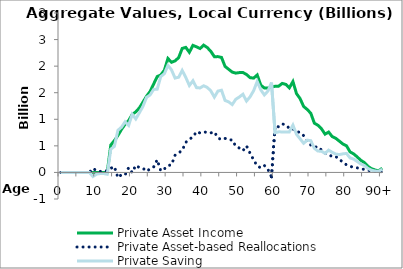
| Category | Private Asset Income | Private Asset-based Reallocations | Private Saving |
|---|---|---|---|
| 0 | 0 | -0.02 | 0.02 |
|  | 0 | 0.034 | -0.034 |
| 2 | 0 | 0 | 0 |
| 3 | 0 | -0.029 | 0.029 |
| 4 | 0 | -0.026 | 0.026 |
| 5 | 0 | -0.035 | 0.035 |
| 6 | 0 | -0.069 | 0.069 |
| 7 | 0 | -0.424 | 0.424 |
| 8 | 0 | -0.85 | 0.85 |
| 9 | 0 | 77.325 | -77.325 |
| 10 | 0 | 33.396 | -33.396 |
| 11 | 0 | 20.393 | -20.393 |
| 12 | 0 | 20.771 | -20.771 |
| 13 | 0 | 34.38 | -34.38 |
| 14 | 515.43 | 77.559 | 437.871 |
| 15 | 599.381 | 109.825 | 489.556 |
| 16 | 695.474 | -97.931 | 793.404 |
| 17 | 809.643 | -41.545 | 851.187 |
| 18 | 906.04 | -46.677 | 952.717 |
| 19 | 975.077 | 90.007 | 885.07 |
| 20 | 1092.235 | -2.998 | 1095.233 |
| 21 | 1139.297 | 132.756 | 1006.541 |
| 22 | 1213.84 | 91.339 | 1122.502 |
| 23 | 1321.48 | 79.38 | 1242.1 |
| 24 | 1432.878 | 21.249 | 1411.629 |
| 25 | 1523.362 | 65.695 | 1457.667 |
| 26 | 1663.328 | 102.21 | 1561.118 |
| 27 | 1804.212 | 237.434 | 1566.778 |
| 28 | 1834.419 | 28.929 | 1805.49 |
| 29 | 1922.656 | 65.812 | 1856.844 |
| 30 | 2143.887 | 129.028 | 2014.858 |
| 31 | 2072.883 | 143.249 | 1929.634 |
| 32 | 2099.247 | 323.238 | 1776.009 |
| 33 | 2159.718 | 368.483 | 1791.235 |
| 34 | 2333.294 | 414.077 | 1919.217 |
| 35 | 2353.371 | 566.41 | 1786.961 |
| 36 | 2261.037 | 625.116 | 1635.921 |
| 37 | 2390.971 | 665.863 | 1725.108 |
| 38 | 2363.328 | 767.933 | 1595.394 |
| 39 | 2331.574 | 741.964 | 1589.61 |
| 40 | 2394.862 | 764.426 | 1630.436 |
| 41 | 2350.668 | 750.603 | 1600.065 |
| 42 | 2279.002 | 743.042 | 1535.959 |
| 43 | 2178.857 | 761.876 | 1416.981 |
| 44 | 2179.139 | 648.56 | 1530.579 |
| 45 | 2164.012 | 617.414 | 1546.599 |
| 46 | 1994.211 | 639.975 | 1354.236 |
| 47 | 1941.277 | 613.893 | 1327.384 |
| 48 | 1887.87 | 610.925 | 1276.945 |
| 49 | 1868.639 | 492.271 | 1376.368 |
| 50 | 1879.011 | 458.972 | 1420.039 |
| 51 | 1879.989 | 409.075 | 1470.914 |
| 52 | 1843.095 | 499.62 | 1343.475 |
| 53 | 1783.655 | 360.898 | 1422.757 |
| 54 | 1774.907 | 236.328 | 1538.579 |
| 55 | 1834.06 | 122.498 | 1711.562 |
| 56 | 1641.244 | 86.83 | 1554.414 |
| 57 | 1589.199 | 130.958 | 1458.241 |
| 58 | 1586.069 | 56.156 | 1529.914 |
| 59 | 1608.156 | -82.749 | 1690.905 |
| 60 | 1620.642 | 875.175 | 745.467 |
| 61 | 1623.108 | 859.183 | 763.925 |
| 62 | 1675.315 | 912.994 | 762.321 |
| 63 | 1656.532 | 895.955 | 760.577 |
| 64 | 1591.247 | 828.712 | 762.536 |
| 65 | 1710.078 | 820.299 | 889.779 |
| 66 | 1483.363 | 765.474 | 717.89 |
| 67 | 1389.002 | 755.754 | 633.248 |
| 68 | 1241.55 | 692.714 | 548.837 |
| 69 | 1184.496 | 577.146 | 607.35 |
| 70 | 1113.736 | 516.489 | 597.248 |
| 71 | 927.448 | 473.286 | 454.162 |
| 72 | 887.477 | 485.545 | 401.933 |
| 73 | 819.824 | 421.077 | 398.747 |
| 74 | 720.245 | 362.473 | 357.772 |
| 75 | 759.578 | 340.141 | 419.438 |
| 76 | 674.13 | 295.627 | 378.503 |
| 77 | 642.142 | 296.897 | 345.245 |
| 78 | 587.951 | 252.411 | 335.54 |
| 79 | 534.535 | 184.739 | 349.796 |
| 80 | 501.477 | 143.811 | 357.665 |
| 81 | 386.41 | 113.546 | 272.863 |
| 82 | 349.088 | 97.583 | 251.506 |
| 83 | 291.921 | 86.237 | 205.684 |
| 84 | 228.549 | 69.728 | 158.821 |
| 85 | 186.278 | 56.064 | 130.214 |
| 86 | 115.012 | 40.624 | 74.387 |
| 87 | 70.597 | 28.154 | 42.442 |
| 88 | 46.234 | 20.266 | 25.967 |
| 89 | 28.445 | 9.767 | 18.678 |
| 90+ | 79.932 | 16.34 | 63.592 |